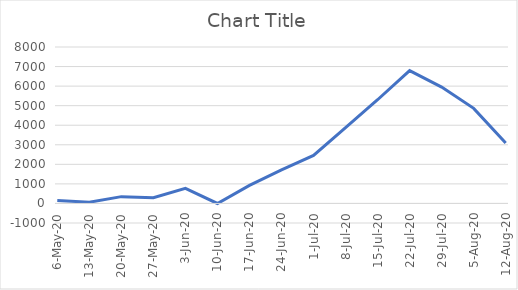
| Category | Series 0 |
|---|---|
| 2020-05-06 | 148 |
| 2020-05-13 | 58 |
| 2020-05-20 | 347.811 |
| 2020-05-27 | 294.981 |
| 2020-06-03 | 768.195 |
| 2020-06-10 | -1.844 |
| 2020-06-17 | 920.839 |
| 2020-06-24 | 1717.344 |
| 2020-07-01 | 2456.038 |
| 2020-07-08 | 3880.724 |
| 2020-07-15 | 5302.519 |
| 2020-07-22 | 6792.194 |
| 2020-07-29 | 5951.017 |
| 2020-08-05 | 4861.702 |
| 2020-08-12 | 3086.373 |